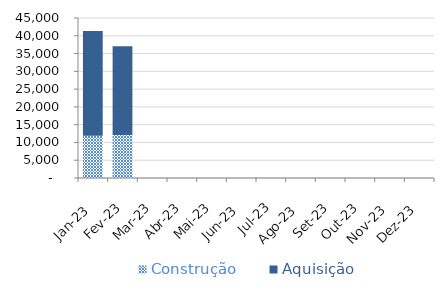
| Category | Construção | Aquisição  |
|---|---|---|
| Jan-23 | 11881 | 29434 |
| Fev-23 | 12073 | 24982 |
| Mar-23 | 0 | 0 |
| Abr-23 | 0 | 0 |
| Mai-23 | 0 | 0 |
| Jun-23 | 0 | 0 |
| Jul-23 | 0 | 0 |
| Ago-23 | 0 | 0 |
| Set-23 | 0 | 0 |
| Out-23 | 0 | 0 |
| Nov-23 | 0 | 0 |
| Dez-23 | 0 | 0 |